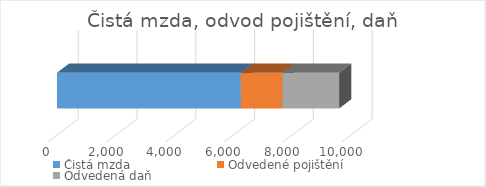
| Category | Čistá mzda | Odvedené pojištění | Odvedená daň |
|---|---|---|---|
| 1935.0 | 6258 | 1407 | 1935 |